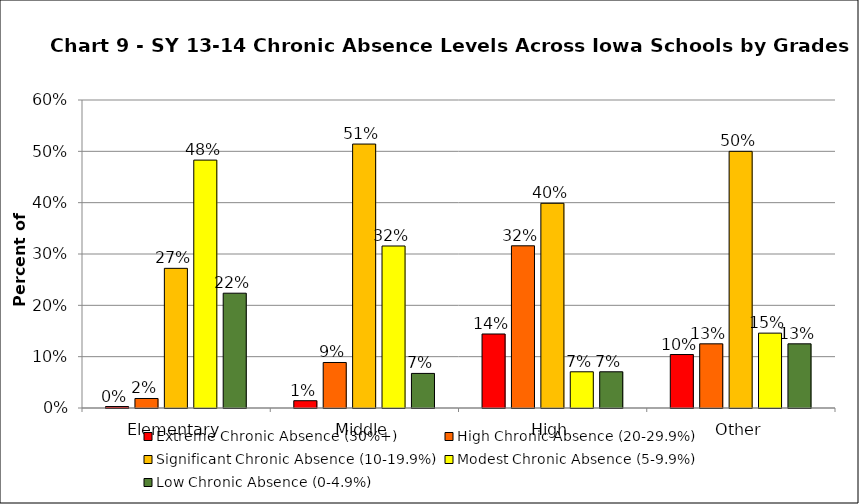
| Category | Extreme Chronic Absence (30%+) | High Chronic Absence (20-29.9%) | Significant Chronic Absence (10-19.9%) | Modest Chronic Absence (5-9.9%) | Low Chronic Absence (0-4.9%) |
|---|---|---|---|---|---|
| 0 | 0.003 | 0.019 | 0.272 | 0.483 | 0.224 |
| 1 | 0.014 | 0.089 | 0.514 | 0.316 | 0.067 |
| 2 | 0.144 | 0.316 | 0.399 | 0.071 | 0.071 |
| 3 | 0.104 | 0.125 | 0.5 | 0.146 | 0.125 |